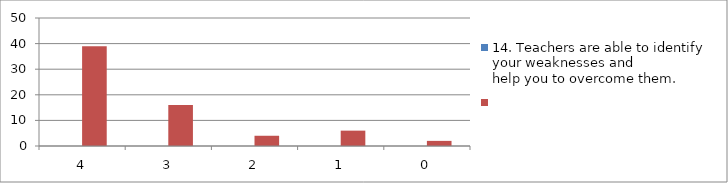
| Category | 14. Teachers are able to identify your weaknesses and
help you to overcome them. | Series 1 |
|---|---|---|
| 4.0 | 0 | 39 |
| 3.0 | 0 | 16 |
| 2.0 | 0 | 4 |
| 1.0 | 0 | 6 |
| 0.0 | 0 | 2 |